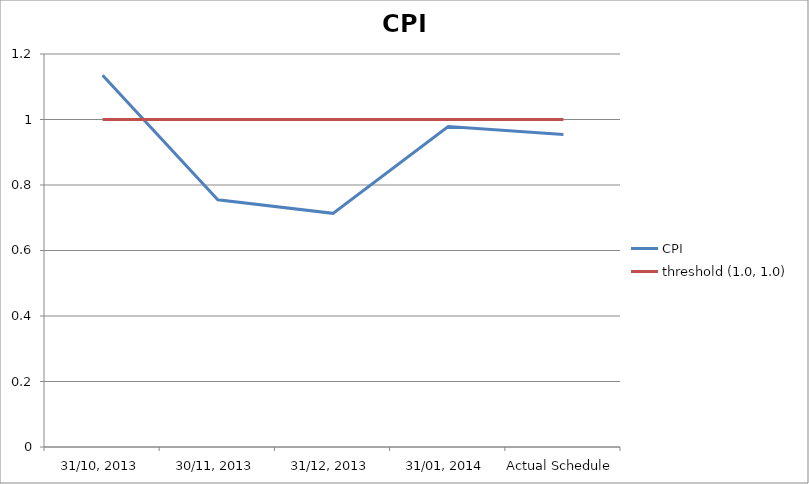
| Category | CPI | threshold (1.0, 1.0) |
|---|---|---|
| 31/10, 2013 | 1.135 | 1 |
| 30/11, 2013 | 0.755 | 1 |
| 31/12, 2013 | 0.714 | 1 |
| 31/01, 2014 | 0.979 | 1 |
| Actual Schedule | 0.954 | 1 |